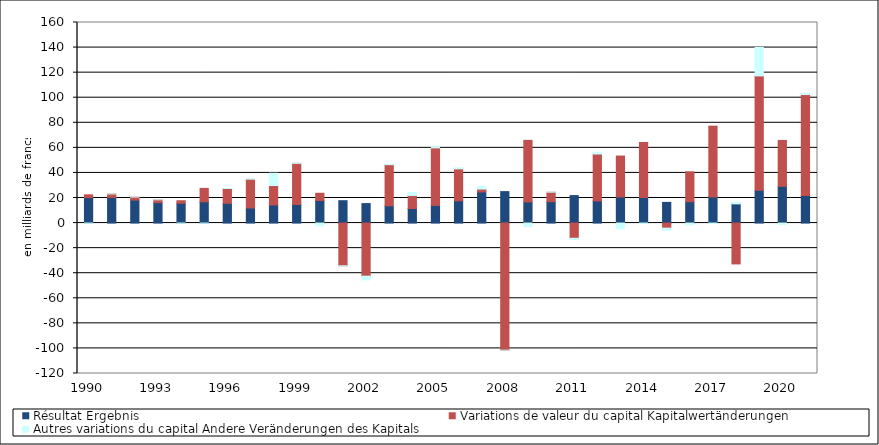
| Category | Résultat | Variations de valeur du capital | Autres variations du capital |
|---|---|---|---|
| 1990.0 | 20.324 | 2.212 | -0.165 |
| 1991.0 | 20.449 | 2.76 | 0.048 |
| 1992.0 | 18.358 | 2.386 | 0.12 |
| 1993.0 | 16.291 | 2.26 | 0.002 |
| 1994.0 | 15.785 | 2.038 | -0.121 |
| 1995.0 | 16.994 | 10.684 | -0.096 |
| 1996.0 | 15.764 | 11.839 | 0.197 |
| 1997.0 | 12.041 | 22.942 | 0.265 |
| 1998.0 | 14.454 | 15.49 | 9.833 |
| 1999.0 | 14.875 | 32.767 | 0.135 |
| 2000.0 | 18.038 | 5.736 | -2.2 |
| 2001.0 | 17.854 | -34.057 | -0.038 |
| 2002.0 | 15.548 | -42.366 | -2.965 |
| 2003.0 | 13.786 | 32.798 | 0.409 |
| 2004.0 | 11.58 | 10.45 | 2.343 |
| 2005.0 | 14.089 | 45.903 | 0.721 |
| 2006.0 | 17.816 | 25.461 | 0.837 |
| 2007.0 | 24.829 | 2.298 | 2.206 |
| 2008.0 | 25.101 | -101.402 | 0 |
| 2009.0 | 16.873 | 49.087 | -2.947 |
| 2010.0 | 17.087 | 7.558 | 0.137 |
| 2011.0 | 21.923 | -12.117 | -0.992 |
| 2012.0 | 17.668 | 37.432 | 1.428 |
| 2013.0 | 20.834 | 32.626 | -4.468 |
| 2014.0 | 20.393 | 43.882 | -0.273 |
| 2015.0 | 16.494 | -4.047 | -1.746 |
| 2016.0 | 17.035 | 23.874 | -1.34 |
| 2017.0 | 20.856 | 56.464 | -0.387 |
| 2018.0 | 15.333 | -32.578 | 1.317 |
| 2019.0 | 26.21 | 91.196 | 22.713 |
| 2020.0 | 29.295 | 36.623 | -1.097 |
| 2021.0 | 22.013 | 80.511 | 0.906 |